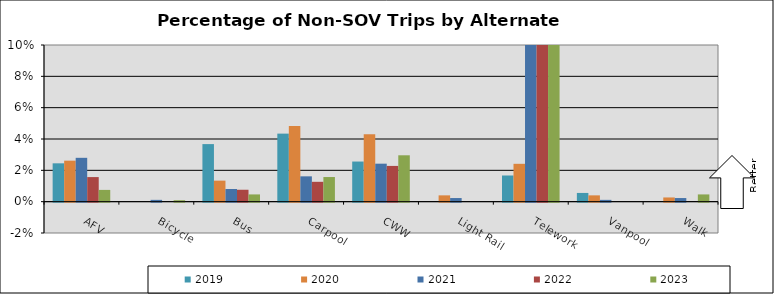
| Category | 2019 | 2020 | 2021 | 2022 | 2023 |
|---|---|---|---|---|---|
| AFV | 0.024 | 0.026 | 0.028 | 0.016 | 0.008 |
| Bicycle | 0 | 0 | 0.001 | 0 | 0.001 |
| Bus | 0.037 | 0.013 | 0.008 | 0.008 | 0.005 |
| Carpool | 0.043 | 0.048 | 0.016 | 0.013 | 0.016 |
| CWW | 0.026 | 0.043 | 0.024 | 0.023 | 0.03 |
| Light Rail | 0 | 0.004 | 0.002 | 0 | 0 |
| Telework | 0.017 | 0.024 | 0.603 | 0.648 | 0.676 |
| Vanpool | 0.006 | 0.004 | 0.001 | 0 | 0 |
| Walk | 0 | 0.003 | 0.002 | 0 | 0.005 |